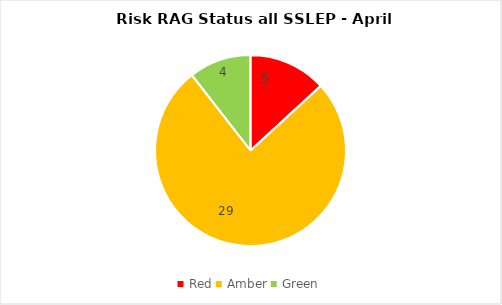
| Category | SSLEP |
|---|---|
| Red | 5 |
| Amber | 29 |
| Green | 4 |